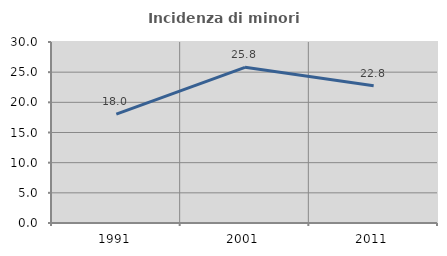
| Category | Incidenza di minori stranieri |
|---|---|
| 1991.0 | 18.033 |
| 2001.0 | 25.806 |
| 2011.0 | 22.766 |